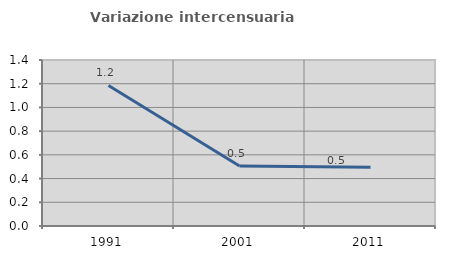
| Category | Variazione intercensuaria annua |
|---|---|
| 1991.0 | 1.185 |
| 2001.0 | 0.506 |
| 2011.0 | 0.495 |